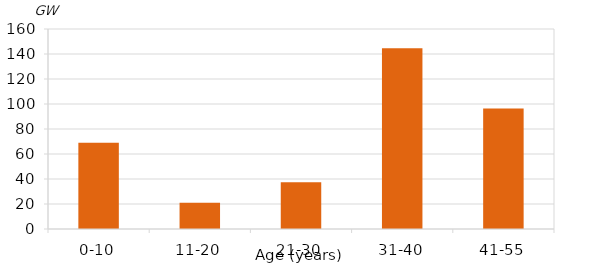
| Category | Net Electrical Capacity by Age |
|---|---|
| 0-10 | 69.068 |
| 11-20 | 20.944 |
| 21-30 | 37.492 |
| 31-40 | 144.609 |
| 41-55 | 96.497 |